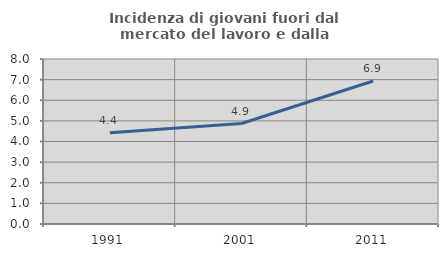
| Category | Incidenza di giovani fuori dal mercato del lavoro e dalla formazione  |
|---|---|
| 1991.0 | 4.425 |
| 2001.0 | 4.872 |
| 2011.0 | 6.932 |